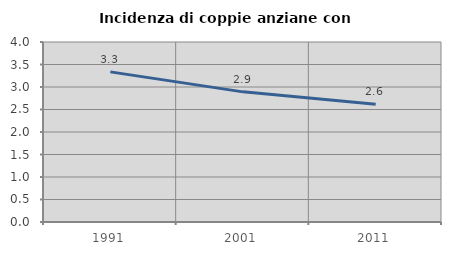
| Category | Incidenza di coppie anziane con figli |
|---|---|
| 1991.0 | 3.336 |
| 2001.0 | 2.892 |
| 2011.0 | 2.614 |